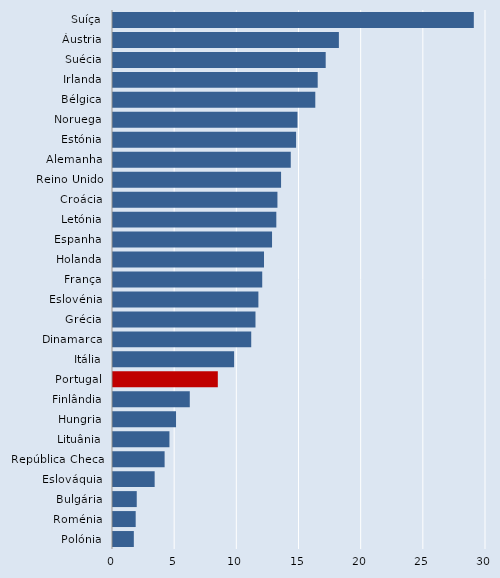
| Category | Series 0 |
|---|---|
| Suíça | 29.02 |
| Áustria | 18.167 |
| Suécia | 17.107 |
| Irlanda | 16.464 |
| Bélgica | 16.271 |
| Noruega | 14.837 |
| Estónia | 14.726 |
| Alemanha | 14.297 |
| Reino Unido | 13.517 |
| Croácia | 13.226 |
| Letónia | 13.136 |
| Espanha | 12.792 |
| Holanda | 12.145 |
| França | 12.002 |
| Eslovénia | 11.694 |
| Grécia | 11.46 |
| Dinamarca | 11.117 |
| Itália | 9.741 |
| Portugal | 8.43 |
| Finlândia | 6.175 |
| Hungria | 5.069 |
| Lituânia | 4.539 |
| República Checa | 4.151 |
| Eslováquia | 3.35 |
| Bulgária | 1.91 |
| Roménia | 1.825 |
| Polónia | 1.676 |